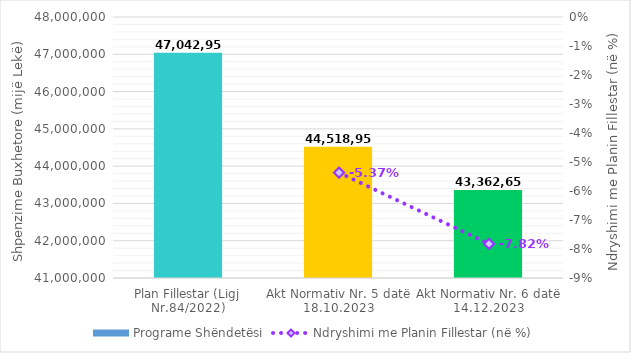
| Category | Programe Shëndetësi |
|---|---|
| Plan Fillestar (Ligj Nr.84/2022) | 47042950 |
| Akt Normativ Nr. 5 datë 18.10.2023 | 44518950 |
| Akt Normativ Nr. 6 datë 14.12.2023 | 43362650 |